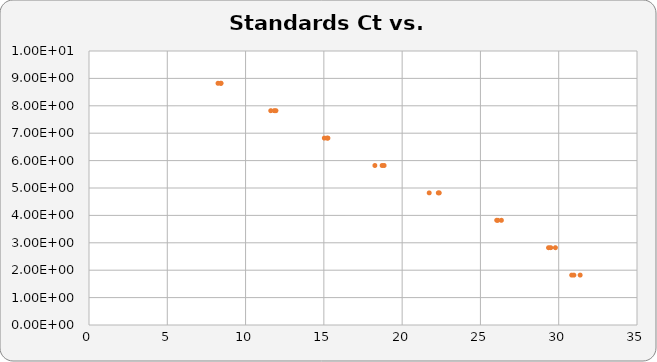
| Category | Series 1 |
|---|---|
| 31.37 | 1.821 |
| 30.97 | 1.821 |
| 30.83 | 1.821 |
| 29.35 | 2.821 |
| 29.49 | 2.821 |
| 29.79 | 2.821 |
| 26.11 | 3.821 |
| 26.34 | 3.821 |
| 26.04 | 3.821 |
| 21.73 | 4.821 |
| 22.31 | 4.821 |
| 22.37 | 4.821 |
| 18.85 | 5.821 |
| 18.72 | 5.821 |
| 18.26 | 5.821 |
| 15.03 | 6.821 |
| 15.26 | 6.821 |
| 15.21 | 6.821 |
| 11.61 | 7.821 |
| 11.94 | 7.821 |
| 11.83 | 7.821 |
| 8.24 | 8.821 |
| 8.42 | 8.821 |
| 8.43 | 8.821 |